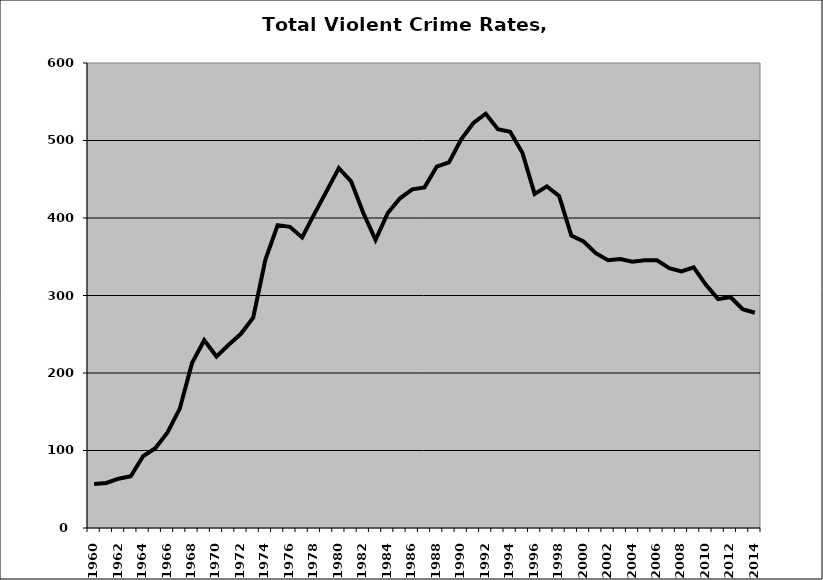
| Category | VCR |
|---|---|
| 1960.0 | 56.638 |
| 1961.0 | 58.132 |
| 1962.0 | 63.639 |
| 1963.0 | 66.689 |
| 1964.0 | 92.527 |
| 1965.0 | 103.043 |
| 1966.0 | 123.255 |
| 1967.0 | 154.001 |
| 1968.0 | 212.759 |
| 1969.0 | 242.299 |
| 1970.0 | 221.344 |
| 1971.0 | 236.445 |
| 1972.0 | 250.566 |
| 1973.0 | 271.479 |
| 1974.0 | 346.26 |
| 1975.0 | 390.83 |
| 1976.0 | 388.594 |
| 1977.0 | 374.904 |
| 1978.0 | 405.299 |
| 1979.0 | 434.641 |
| 1980.0 | 464.295 |
| 1981.0 | 447.27 |
| 1982.0 | 406.384 |
| 1983.0 | 371.767 |
| 1984.0 | 406.438 |
| 1985.0 | 425.425 |
| 1986.0 | 437.038 |
| 1987.0 | 439.511 |
| 1988.0 | 466.4 |
| 1989.0 | 471.75 |
| 1990.0 | 501.573 |
| 1991.0 | 522.599 |
| 1992.0 | 534.54 |
| 1993.0 | 514.558 |
| 1994.0 | 511.267 |
| 1995.0 | 484.257 |
| 1996.0 | 431.177 |
| 1997.0 | 440.766 |
| 1998.0 | 428.546 |
| 1999.0 | 377.252 |
| 2000.0 | 369.656 |
| 2001.0 | 354.691 |
| 2002.0 | 345.538 |
| 2003.0 | 346.941 |
| 2004.0 | 343.642 |
| 2005.0 | 345.603 |
| 2006.0 | 345.539 |
| 2007.0 | 335.213 |
| 2008.0 | 331.081 |
| 2009.0 | 336.305 |
| 2010.0 | 313.791 |
| 2011.0 | 295.342 |
| 2012.0 | 298.072 |
| 2013.0 | 282.359 |
| 2014.0 | 277.73 |